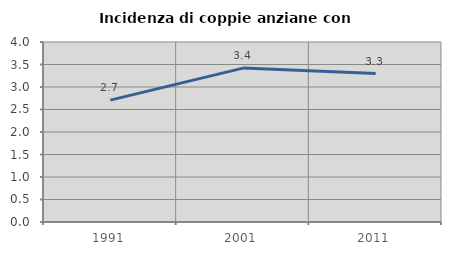
| Category | Incidenza di coppie anziane con figli |
|---|---|
| 1991.0 | 2.708 |
| 2001.0 | 3.42 |
| 2011.0 | 3.3 |